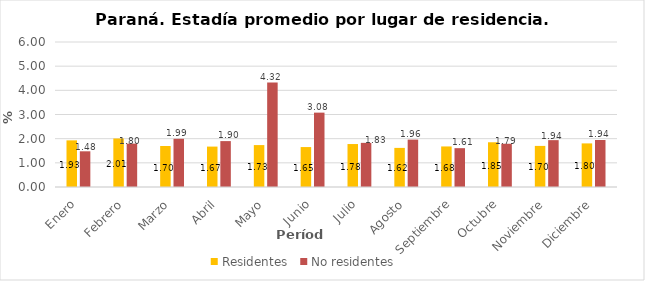
| Category | Residentes | No residentes |
|---|---|---|
| Enero | 1.93 | 1.477 |
| Febrero | 2.007 | 1.795 |
| Marzo | 1.697 | 1.995 |
| Abril | 1.672 | 1.899 |
| Mayo | 1.734 | 4.32 |
| Junio | 1.653 | 3.077 |
| Julio | 1.778 | 1.826 |
| Agosto | 1.618 | 1.961 |
| Septiembre | 1.678 | 1.607 |
| Octubre | 1.851 | 1.789 |
| Noviembre | 1.701 | 1.939 |
| Diciembre | 1.804 | 1.944 |